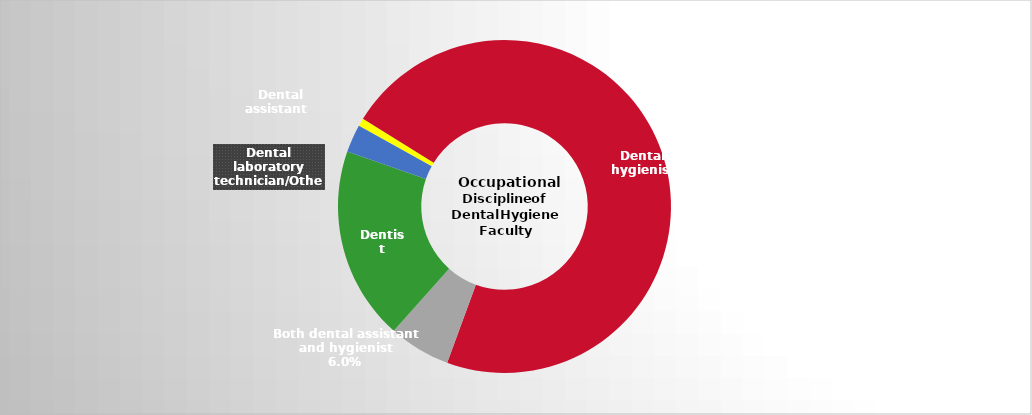
| Category | Series 2 |
|---|---|
| Dental assistant   | 0.008 |
| Dental hygienist | 0.718 |
| Both dental assistant and hygienist | 0.06 |
| Dentist | 0.188 |
| Dental laboratory technician/Other | 0.027 |